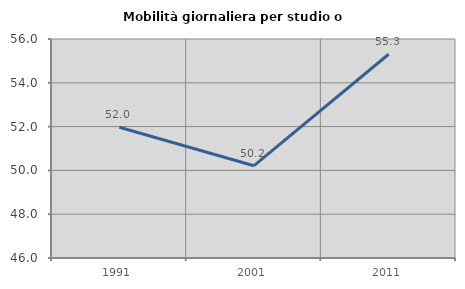
| Category | Mobilità giornaliera per studio o lavoro |
|---|---|
| 1991.0 | 51.971 |
| 2001.0 | 50.215 |
| 2011.0 | 55.305 |